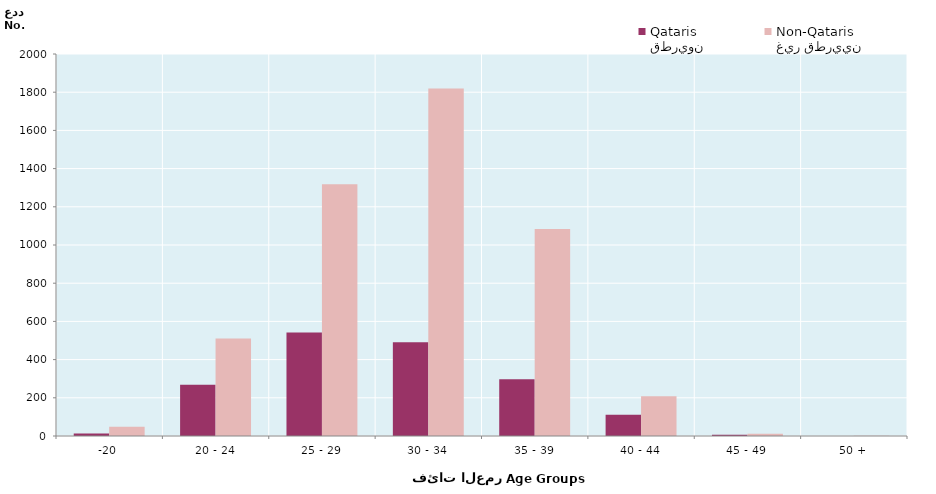
| Category | قطريون
Qataris | غير قطريين
Non-Qataris |
|---|---|---|
| -20 | 13 | 48 |
| 20 - 24 | 268 | 511 |
| 25 - 29 | 542 | 1318 |
| 30 - 34 | 491 | 1819 |
| 35 - 39 | 297 | 1084 |
| 40 - 44 | 111 | 208 |
| 45 - 49 | 6 | 12 |
| 50 + | 0 | 1 |